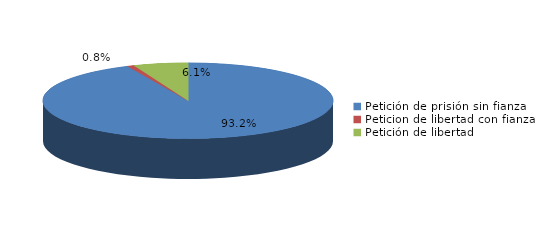
| Category | Series 0 |
|---|---|
| Petición de prisión sin fianza | 123 |
| Peticion de libertad con fianza | 1 |
| Petición de libertad | 8 |